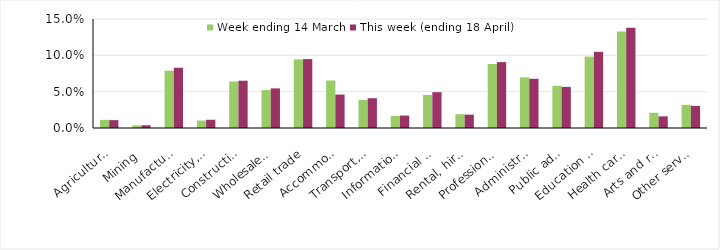
| Category | Week ending 14 March | This week (ending 18 April) |
|---|---|---|
| Agriculture, forestry and fishing | 0.011 | 0.011 |
| Mining | 0.004 | 0.004 |
| Manufacturing | 0.079 | 0.083 |
| Electricity, gas, water and waste services | 0.01 | 0.011 |
| Construction | 0.064 | 0.065 |
| Wholesale trade | 0.052 | 0.055 |
| Retail trade | 0.094 | 0.095 |
| Accommodation and food services | 0.065 | 0.046 |
| Transport, postal and warehousing | 0.039 | 0.041 |
| Information media and telecommunications | 0.017 | 0.017 |
| Financial and insurance services | 0.046 | 0.049 |
| Rental, hiring and real estate services | 0.019 | 0.018 |
| Professional, scientific and technical services | 0.088 | 0.091 |
| Administrative and support services | 0.07 | 0.068 |
| Public administration and safety | 0.058 | 0.057 |
| Education and training | 0.098 | 0.105 |
| Health care and social assistance | 0.133 | 0.138 |
| Arts and recreation services | 0.021 | 0.016 |
| Other services | 0.032 | 0.03 |